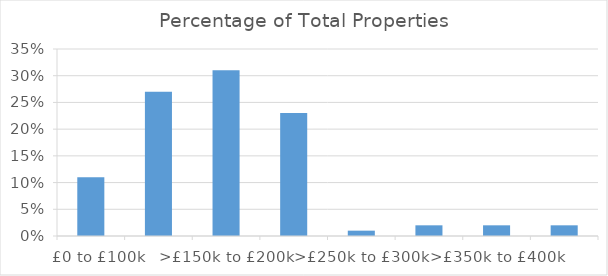
| Category | Percentage of Total Properties (%) |
|---|---|
|    £0 to £100k | 0.11 |
| >£100k to £150k | 0.27 |
| >£150k to £200k | 0.31 |
| >£200k to £250k | 0.23 |
| >£250k to £300k | 0.01 |
| >£300k to £350k | 0.02 |
| >£350k to £400k | 0.02 |
| >£400k to £450k | 0.02 |